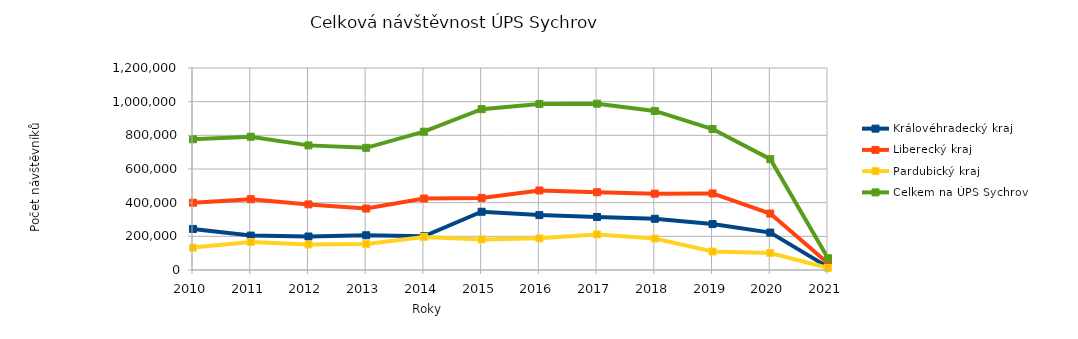
| Category | Královéhradecký kraj | Liberecký kraj | Pardubický kraj | Celkem na ÚPS Sychrov |
|---|---|---|---|---|
| 2010.0 | 243910 | 399672 | 133004 | 776586 |
| 2011.0 | 204481 | 420780 | 166238 | 791499 |
| 2012.0 | 199025 | 389781 | 151509 | 740315 |
| 2013.0 | 206419 | 365108 | 154165 | 725692 |
| 2014.0 | 200438 | 424718 | 196473 | 821629 |
| 2015.0 | 345970 | 428023 | 181567 | 955560 |
| 2016.0 | 326137 | 472318 | 188108 | 986563 |
| 2017.0 | 314983 | 461803 | 211268 | 988054 |
| 2018.0 | 304267 | 453568 | 187017 | 944852 |
| 2019.0 | 272720 | 454785 | 109949 | 837454 |
| 2020.0 | 222238 | 335261 | 101211 | 658710 |
| 2021.0 | 17242 | 40077 | 12590 | 69909 |